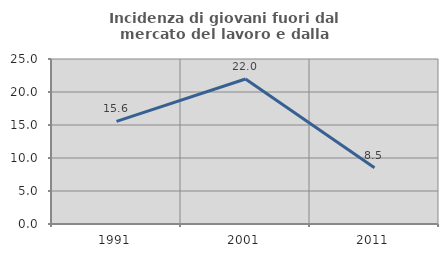
| Category | Incidenza di giovani fuori dal mercato del lavoro e dalla formazione  |
|---|---|
| 1991.0 | 15.556 |
| 2001.0 | 21.964 |
| 2011.0 | 8.537 |